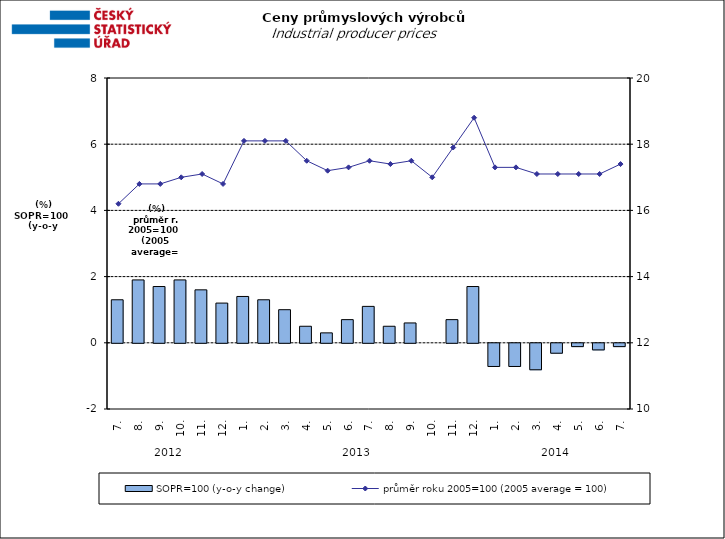
| Category | SOPR=100 (y-o-y change)   |
|---|---|
| 0 | 1.3 |
| 1 | 1.9 |
| 2 | 1.7 |
| 3 | 1.9 |
| 4 | 1.6 |
| 5 | 1.2 |
| 6 | 1.4 |
| 7 | 1.3 |
| 8 | 1 |
| 9 | 0.5 |
| 10 | 0.3 |
| 11 | 0.7 |
| 12 | 1.1 |
| 13 | 0.5 |
| 14 | 0.6 |
| 15 | 0 |
| 16 | 0.7 |
| 17 | 1.7 |
| 18 | -0.7 |
| 19 | -0.7 |
| 20 | -0.8 |
| 21 | -0.3 |
| 22 | -0.1 |
| 23 | -0.2 |
| 24 | -0.1 |